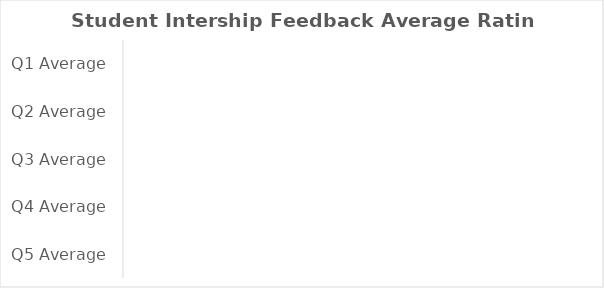
| Category | Series 0 |
|---|---|
| Q1 Average | 0 |
| Q2 Average | 0 |
| Q3 Average | 0 |
| Q4 Average | 0 |
| Q5 Average | 0 |